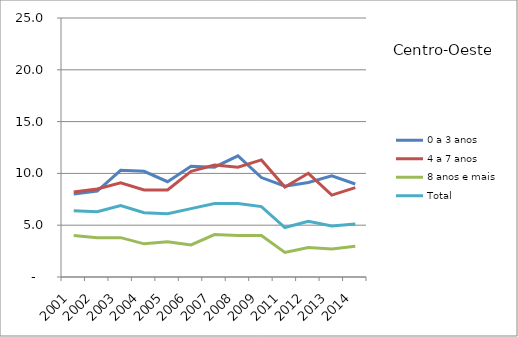
| Category | 0 a 3 anos | 4 a 7 anos | 8 anos e mais | Total |
|---|---|---|---|---|
| 2001.0 | 8 | 8.2 | 4 | 6.4 |
| 2002.0 | 8.3 | 8.5 | 3.8 | 6.3 |
| 2003.0 | 10.3 | 9.1 | 3.8 | 6.9 |
| 2004.0 | 10.2 | 8.4 | 3.2 | 6.2 |
| 2005.0 | 9.2 | 8.4 | 3.4 | 6.1 |
| 2006.0 | 10.7 | 10.2 | 3.1 | 6.6 |
| 2007.0 | 10.6 | 10.8 | 4.1 | 7.1 |
| 2008.0 | 11.7 | 10.6 | 4 | 7.1 |
| 2009.0 | 9.6 | 11.3 | 4 | 6.8 |
| 2011.0 | 8.764 | 8.684 | 2.379 | 4.778 |
| 2012.0 | 9.126 | 10.01 | 2.852 | 5.367 |
| 2013.0 | 9.768 | 7.909 | 2.699 | 4.917 |
| 2014.0 | 8.974 | 8.625 | 2.978 | 5.106 |